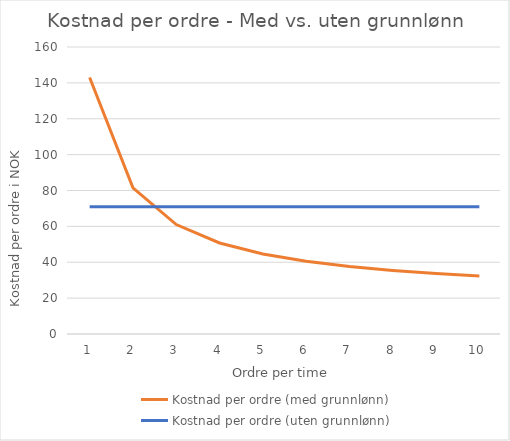
| Category | Kostnad per ordre (med grunnlønn) | Kostnad per ordre (uten grunnlønn) |
|---|---|---|
| 0 | 143 | 71 |
| 1 | 81.5 | 71 |
| 2 | 61 | 71 |
| 3 | 50.75 | 71 |
| 4 | 44.6 | 71 |
| 5 | 40.5 | 71 |
| 6 | 37.571 | 71 |
| 7 | 35.375 | 71 |
| 8 | 33.667 | 71 |
| 9 | 32.3 | 71 |